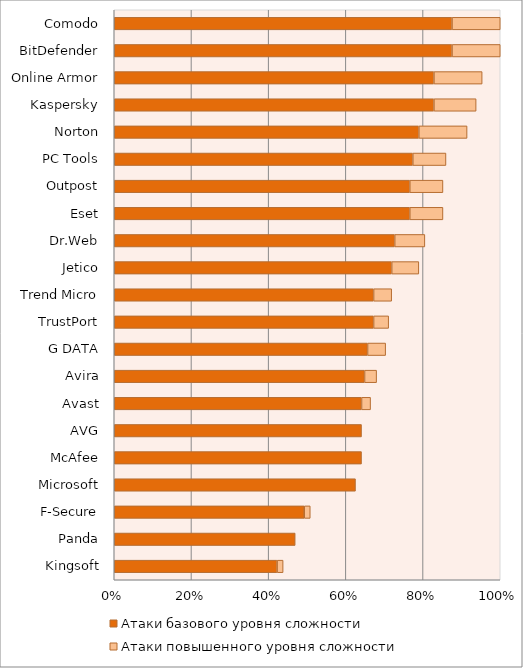
| Category | Атаки базового уровня сложности | Атаки повышенного уровня сложности |
|---|---|---|
| Comodo | 0.875 | 0.125 |
| BitDefender | 0.875 | 0.125 |
| Online Armor | 0.828 | 0.125 |
| Kaspersky | 0.828 | 0.109 |
| Norton | 0.789 | 0.125 |
| PC Tools | 0.773 | 0.086 |
| Outpost | 0.766 | 0.086 |
| Eset | 0.766 | 0.086 |
| Dr.Web | 0.727 | 0.078 |
| Jetico | 0.719 | 0.07 |
| Trend Micro | 0.672 | 0.047 |
| TrustPort | 0.672 | 0.039 |
| G DATA | 0.656 | 0.047 |
| Avira | 0.648 | 0.031 |
| Avast | 0.641 | 0.023 |
| AVG | 0.641 | 0 |
| McAfee | 0.641 | 0 |
| Microsoft | 0.625 | 0 |
| F-Secure | 0.492 | 0.016 |
| Panda | 0.469 | 0 |
| Kingsoft | 0.422 | 0.016 |